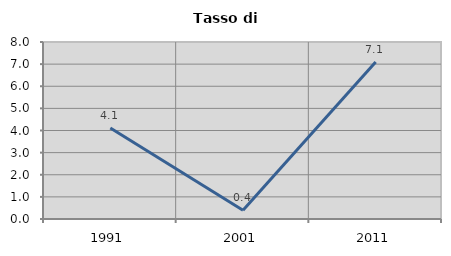
| Category | Tasso di disoccupazione   |
|---|---|
| 1991.0 | 4.11 |
| 2001.0 | 0.397 |
| 2011.0 | 7.095 |